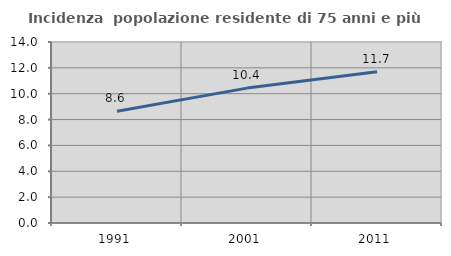
| Category | Incidenza  popolazione residente di 75 anni e più |
|---|---|
| 1991.0 | 8.642 |
| 2001.0 | 10.433 |
| 2011.0 | 11.697 |